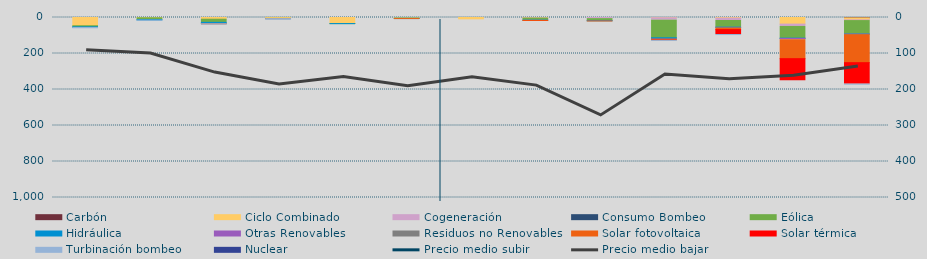
| Category | Carbón | Ciclo Combinado | Cogeneración | Consumo Bombeo | Eólica | Hidráulica | Otras Renovables | Residuos no Renovables | Solar fotovoltaica | Solar térmica | Turbinación bombeo | Nuclear |
|---|---|---|---|---|---|---|---|---|---|---|---|---|
| 0 | 0 | 45653 | 130.2 | 0 | 6042.2 | 3888 | 0 | 0 | 0 | 0 | 1300 | 0 |
| 1 | 0 | 1436.8 | 180 | 0 | 9933.5 | 2555.1 | 260 | 362.7 | 0 | 0 | 330 | 0 |
| 2 | 0 | 9373.3 | 187.6 | 0 | 17462.5 | 7049 | 0 | 0 | 881.5 | 0 | 630 | 0 |
| 3 | 0 | 4799.8 | 0 | 0 | 1194.5 | 10 | 0 | 0 | 206.3 | 0 | 3200 | 0 |
| 4 | 0 | 33709.9 | 8 | 0 | 110.5 | 209.5 | 0 | 0 | 0 | 0 | 0 | 0 |
| 5 | 0 | 3930.7 | 0 | 0 | 149.1 | 1762.1 | 0 | 0 | 18.8 | 0 | 0 | 0 |
| 6 | 0 | 7388.9 | 0 | 0 | 0 | 0 | 0 | 0 | 0 | 0 | 0 | 0 |
| 7 | 0 | 582 | 2829.7 | 0 | 11683.6 | 231.6 | 1182.5 | 0 | 155.2 | 1067.3 | 0 | 0 |
| 8 | 0 | 0 | 6237.3 | 0 | 10203.7 | 1917.8 | 944.6 | 0 | 48.1 | 0 | 0 | 0 |
| 9 | 0 | 1230 | 13598.7 | 0 | 97489.7 | 5402.7 | 1813.8 | 1013 | 3586.5 | 2430.1 | 317.4 | 0 |
| 10 | 0 | 3090.6 | 13474.7 | 0 | 37149 | 1123.6 | 3207.9 | 675 | 8550.9 | 27054.6 | 431 | 0 |
| 11 | 0 | 36734.9 | 12855.2 | 0 | 65071.5 | 1518 | 6583 | 675 | 105142.4 | 122842 | 0 | 0 |
| 12 | 2096 | 11203.8 | 3780.2 | 0 | 74938.3 | 359.9 | 3182.9 | 0 | 155352.2 | 119223.3 | 200 | 0 |